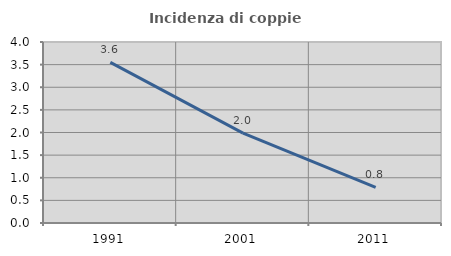
| Category | Incidenza di coppie miste |
|---|---|
| 1991.0 | 3.55 |
| 2001.0 | 1.987 |
| 2011.0 | 0.787 |